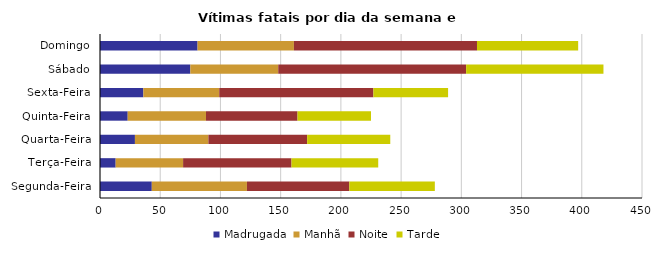
| Category | Madrugada | Manhã | Noite | Tarde |
|---|---|---|---|---|
| Segunda-Feira | 43 | 79 | 85 | 71 |
| Terça-Feira | 13 | 56 | 90 | 72 |
| Quarta-Feira | 29 | 61 | 82 | 69 |
| Quinta-Feira | 23 | 65 | 76 | 61 |
| Sexta-Feira | 36 | 63 | 128 | 62 |
| Sábado | 75 | 73 | 156 | 114 |
| Domingo | 81 | 80 | 152 | 84 |